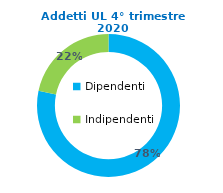
| Category | Series 0 |
|---|---|
| Dipendenti | 96859 |
| Indipendenti | 26874 |